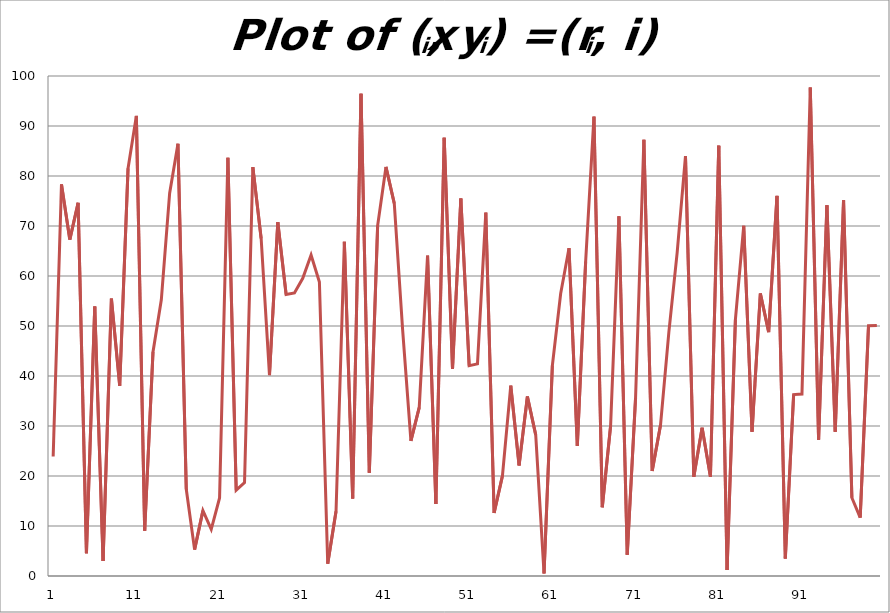
| Category | Series 0 |
|---|---|
| 1.0 | 23.891 |
| 2.0 | 78.33 |
| 3.0 | 67.291 |
| 4.0 | 74.639 |
| 5.0 | 4.552 |
| 6.0 | 53.913 |
| 7.0 | 3.013 |
| 8.0 | 55.484 |
| 9.0 | 38.037 |
| 10.0 | 81.516 |
| 11.0 | 92.022 |
| 12.0 | 9.061 |
| 13.0 | 44.822 |
| 14.0 | 55.246 |
| 15.0 | 76.572 |
| 16.0 | 86.455 |
| 17.0 | 17.349 |
| 18.0 | 5.273 |
| 19.0 | 13.077 |
| 20.0 | 9.338 |
| 21.0 | 15.618 |
| 22.0 | 83.639 |
| 23.0 | 17.176 |
| 24.0 | 18.673 |
| 25.0 | 81.789 |
| 26.0 | 67.498 |
| 27.0 | 40.186 |
| 28.0 | 70.783 |
| 29.0 | 56.297 |
| 30.0 | 56.605 |
| 31.0 | 59.532 |
| 32.0 | 64.178 |
| 33.0 | 58.785 |
| 34.0 | 2.462 |
| 35.0 | 12.956 |
| 36.0 | 66.862 |
| 37.0 | 15.51 |
| 38.0 | 96.459 |
| 39.0 | 20.647 |
| 40.0 | 70.086 |
| 41.0 | 81.816 |
| 42.0 | 74.505 |
| 43.0 | 49.34 |
| 44.0 | 27.025 |
| 45.0 | 33.713 |
| 46.0 | 64.074 |
| 47.0 | 14.4 |
| 48.0 | 87.636 |
| 49.0 | 41.431 |
| 50.0 | 75.495 |
| 51.0 | 42.061 |
| 52.0 | 42.431 |
| 53.0 | 72.675 |
| 54.0 | 12.595 |
| 55.0 | 20.023 |
| 56.0 | 38.065 |
| 57.0 | 22.107 |
| 58.0 | 35.901 |
| 59.0 | 28.219 |
| 60.0 | 0.507 |
| 61.0 | 42.1 |
| 62.0 | 56.49 |
| 63.0 | 65.565 |
| 64.0 | 26.027 |
| 65.0 | 62.88 |
| 66.0 | 91.88 |
| 67.0 | 13.751 |
| 68.0 | 30.036 |
| 69.0 | 71.936 |
| 70.0 | 4.244 |
| 71.0 | 35.605 |
| 72.0 | 87.259 |
| 73.0 | 20.993 |
| 74.0 | 30.192 |
| 75.0 | 48.718 |
| 76.0 | 64.665 |
| 77.0 | 83.994 |
| 78.0 | 19.84 |
| 79.0 | 29.642 |
| 80.0 | 19.857 |
| 81.0 | 86.068 |
| 82.0 | 1.191 |
| 83.0 | 51.261 |
| 84.0 | 70.038 |
| 85.0 | 28.851 |
| 86.0 | 56.505 |
| 87.0 | 48.775 |
| 88.0 | 76.019 |
| 89.0 | 3.491 |
| 90.0 | 36.289 |
| 91.0 | 36.385 |
| 92.0 | 97.714 |
| 93.0 | 27.238 |
| 94.0 | 74.139 |
| 95.0 | 28.837 |
| 96.0 | 75.144 |
| 97.0 | 15.64 |
| 98.0 | 11.685 |
| 99.0 | 50.072 |
| 100.0 | 50.123 |